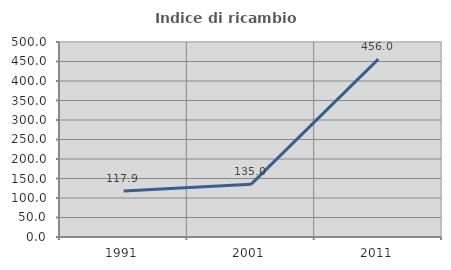
| Category | Indice di ricambio occupazionale  |
|---|---|
| 1991.0 | 117.949 |
| 2001.0 | 135 |
| 2011.0 | 456 |